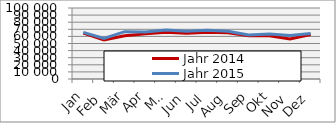
| Category | Jahr 2014 | Jahr 2015 |
|---|---|---|
| 0 | 64556.884 | 65611.325 |
| 1 | 55004.687 | 57166.916 |
| 2 | 60770.277 | 66626.646 |
| 3 | 63565.178 | 66282.449 |
| 4 | 65729.813 | 69021.234 |
| 5 | 64266.71 | 67322.452 |
| 6 | 65932.95 | 68808.953 |
| 7 | 65213.505 | 67339.579 |
| 8 | 61072.078 | 61980.486 |
| 9 | 60775.235 | 63424.583 |
| 10 | 56367.413 | 61328.695 |
| 11 | 62641.039 | 64219.52 |